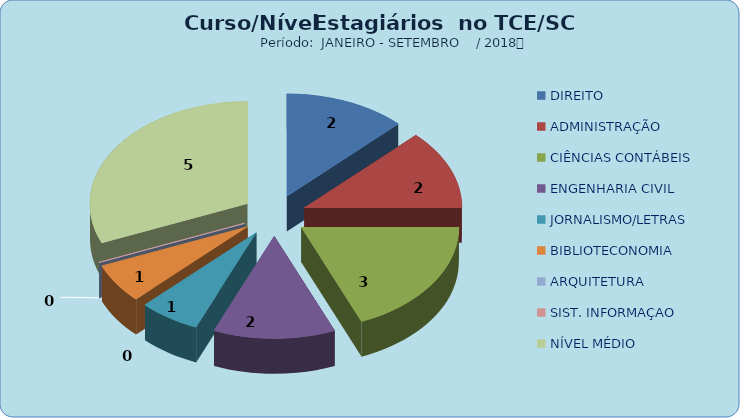
| Category | Series 0 |
|---|---|
| DIREITO | 2 |
| ADMINISTRAÇÃO | 2 |
| CIÊNCIAS CONTÁBEIS | 3 |
| ENGENHARIA CIVIL | 2 |
| JORNALISMO/LETRAS | 1 |
| BIBLIOTECONOMIA | 1 |
| ARQUITETURA | 0 |
| SIST. INFORMAÇAO | 0 |
| NÍVEL MÉDIO | 5 |